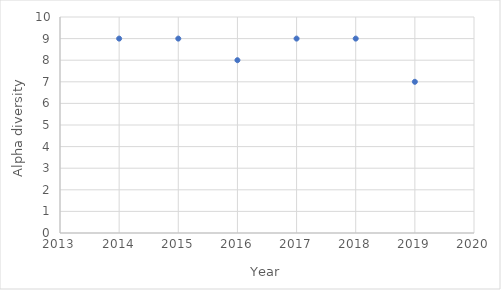
| Category | Alpha |
|---|---|
| 2014.0 | 9 |
| 2015.0 | 9 |
| 2016.0 | 8 |
| 2017.0 | 9 |
| 2018.0 | 9 |
| 2019.0 | 7 |